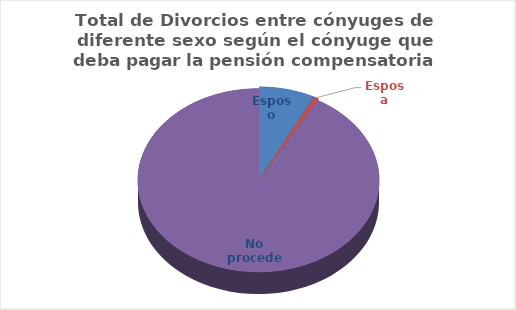
| Category | Series 0 |
|---|---|
| Esposo | 5667 |
| Esposa | 521 |
| No procede | 69918 |